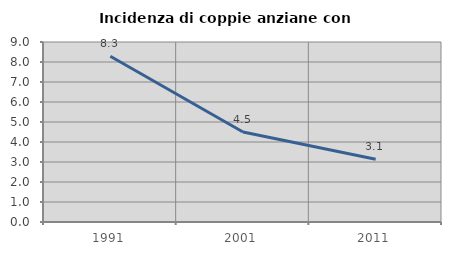
| Category | Incidenza di coppie anziane con figli |
|---|---|
| 1991.0 | 8.287 |
| 2001.0 | 4.5 |
| 2011.0 | 3.139 |